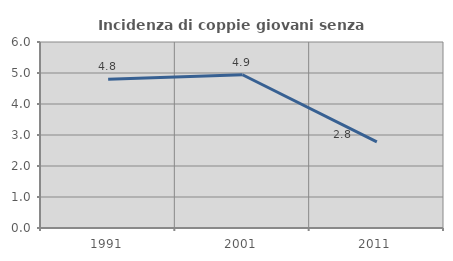
| Category | Incidenza di coppie giovani senza figli |
|---|---|
| 1991.0 | 4.802 |
| 2001.0 | 4.944 |
| 2011.0 | 2.778 |